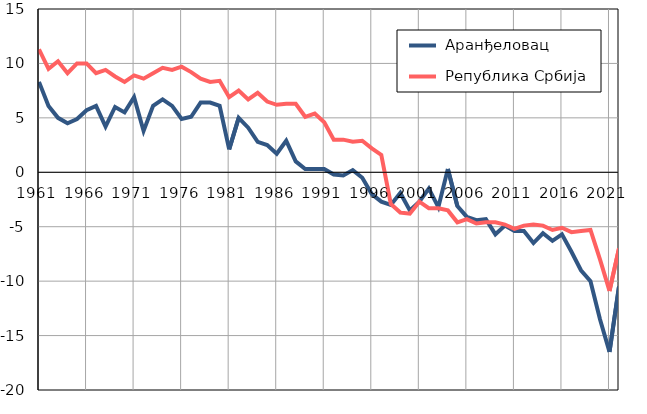
| Category |  Аранђеловац |  Република Србија |
|---|---|---|
| 1961.0 | 8.3 | 11.3 |
| 1962.0 | 6.1 | 9.5 |
| 1963.0 | 5 | 10.2 |
| 1964.0 | 4.5 | 9.1 |
| 1965.0 | 4.9 | 10 |
| 1966.0 | 5.7 | 10 |
| 1967.0 | 6.1 | 9.1 |
| 1968.0 | 4.2 | 9.4 |
| 1969.0 | 6 | 8.8 |
| 1970.0 | 5.5 | 8.3 |
| 1971.0 | 6.9 | 8.9 |
| 1972.0 | 3.8 | 8.6 |
| 1973.0 | 6.1 | 9.1 |
| 1974.0 | 6.7 | 9.6 |
| 1975.0 | 6.1 | 9.4 |
| 1976.0 | 4.9 | 9.7 |
| 1977.0 | 5.1 | 9.2 |
| 1978.0 | 6.4 | 8.6 |
| 1979.0 | 6.4 | 8.3 |
| 1980.0 | 6.1 | 8.4 |
| 1981.0 | 2.1 | 6.9 |
| 1982.0 | 5 | 7.5 |
| 1983.0 | 4.1 | 6.7 |
| 1984.0 | 2.8 | 7.3 |
| 1985.0 | 2.5 | 6.5 |
| 1986.0 | 1.7 | 6.2 |
| 1987.0 | 2.9 | 6.3 |
| 1988.0 | 1 | 6.3 |
| 1989.0 | 0.3 | 5.1 |
| 1990.0 | 0.3 | 5.4 |
| 1991.0 | 0.3 | 4.6 |
| 1992.0 | -0.2 | 3 |
| 1993.0 | -0.3 | 3 |
| 1994.0 | 0.2 | 2.8 |
| 1995.0 | -0.5 | 2.9 |
| 1996.0 | -2 | 2.2 |
| 1997.0 | -2.7 | 1.6 |
| 1998.0 | -3 | -2.9 |
| 1999.0 | -1.9 | -3.7 |
| 2000.0 | -3.5 | -3.8 |
| 2001.0 | -2.7 | -2.7 |
| 2002.0 | -1.5 | -3.3 |
| 2003.0 | -3.2 | -3.3 |
| 2004.0 | 0.3 | -3.5 |
| 2005.0 | -3.1 | -4.6 |
| 2006.0 | -4.1 | -4.3 |
| 2007.0 | -4.4 | -4.7 |
| 2008.0 | -4.3 | -4.6 |
| 2009.0 | -5.7 | -4.6 |
| 2010.0 | -4.9 | -4.8 |
| 2011.0 | -5.4 | -5.2 |
| 2012.0 | -5.4 | -4.9 |
| 2013.0 | -6.5 | -4.8 |
| 2014.0 | -5.6 | -4.9 |
| 2015.0 | -6.3 | -5.3 |
| 2016.0 | -5.7 | -5.1 |
| 2017.0 | -7.3 | -5.5 |
| 2018.0 | -9 | -5.4 |
| 2019.0 | -10 | -5.3 |
| 2020.0 | -13.5 | -8 |
| 2021.0 | -16.5 | -10.9 |
| 2022.0 | -10.5 | -7 |